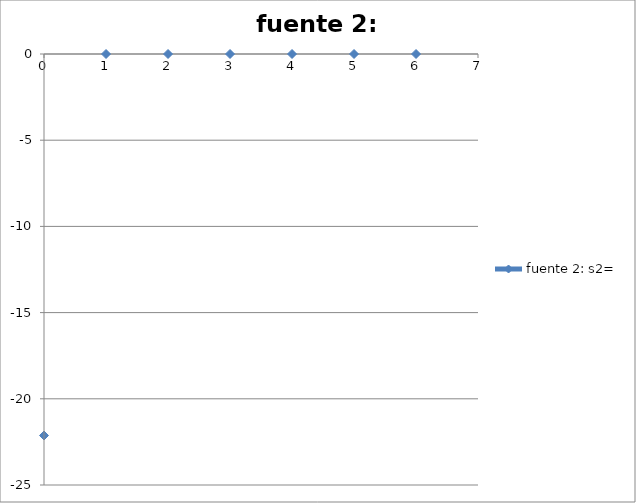
| Category | fuente 2: s2= |
|---|---|
| 0.0 | -22.128 |
| 1.0 | 0 |
| 2.0 | 0 |
| 3.0 | 0 |
| 4.0 | 0 |
| 5.0 | 0 |
| 6.0 | 0 |